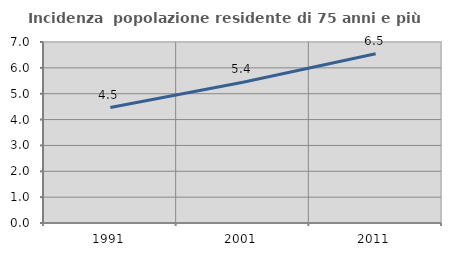
| Category | Incidenza  popolazione residente di 75 anni e più |
|---|---|
| 1991.0 | 4.463 |
| 2001.0 | 5.441 |
| 2011.0 | 6.549 |